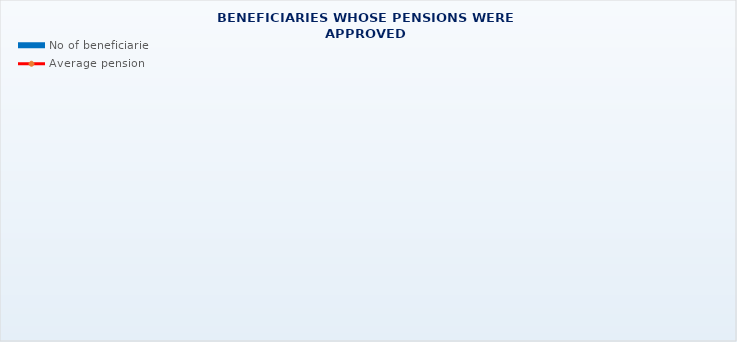
| Category | No of beneficiaries |
|---|---|
| Authorised officials in internal affairs, judicial officers and workers engaged in demining work: | 17264 |
| Pension beneficiaries entitled under the Fire Services Act (Official Gazette 125/19)* | 169 |
| Active military personnel - DVO  | 15905 |
| Croatian Homeland Army veterans mobilised from 1941 to 1945 | 2839 |
| Former political prisoners | 2457 |
| Croatian Veterans from the Homeland War - ZOHBDR (Act on Croatian Homeland War Veterans and Their Family Members) | 70785 |
| Pensions approved under general regulations and determined according to the Act on the Rights of Croatian Homeland War Veterans and their Family Members (ZOHBDR), in 2017 (Art. 27, 35, 48 and 49, paragraph 2)    | 50039 |
| Former Yugoslav People's Army members - JNA   | 4519 |
| Former Yugoslav People's Army members - JNA - Art. 185 of Pension Insurance Act (ZOMO)  | 159 |
| National Liberation War veterans - NOR | 7063 |
| Members of the Croatian Parliament, members of the Government, judges of the Constitutional Court and the Auditor General | 685 |
| Members of the Parliamentary Executive Council and administratively retired federal civil servants  (relates to the former SFRY) | 76 |
| Former officials of federal bodies o the former SFRJ -  Article 38 of the Pension Insurance Act (ZOMO) | 27 |
| Full members of the Croatian Academy of Sciences and Arts - HAZU | 128 |
| Miners from the Istrian coal mines "Tupljak" d.d. Labin  | 245 |
| Workers professionally exposed to asbestos | 852 |
| Insurees - crew members on a ship in international and national navigation  - Article  129, paragraph 2 of the Maritime Code | 200 |
| Members of the Croatian Defence Council - HVO  | 6773 |